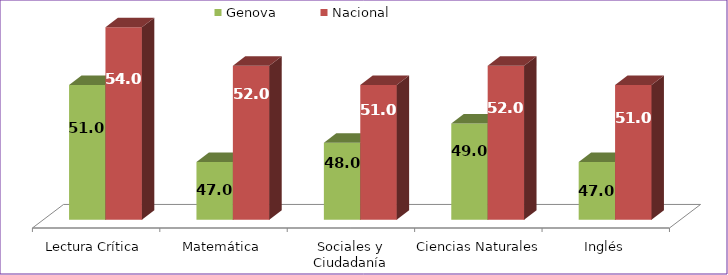
| Category | Genova | Nacional |
|---|---|---|
| Lectura Crítica | 51 | 54 |
| Matemática | 47 | 52 |
| Sociales y Ciudadanía | 48 | 51 |
| Ciencias Naturales | 49 | 52 |
| Inglés | 47 | 51 |